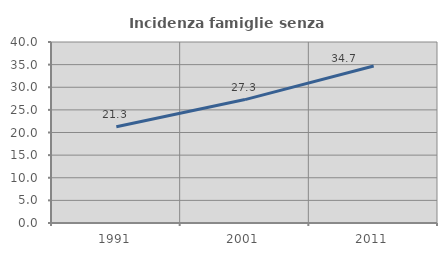
| Category | Incidenza famiglie senza nuclei |
|---|---|
| 1991.0 | 21.272 |
| 2001.0 | 27.273 |
| 2011.0 | 34.712 |